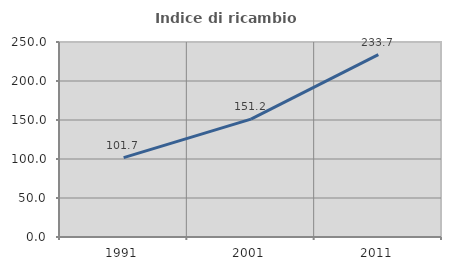
| Category | Indice di ricambio occupazionale  |
|---|---|
| 1991.0 | 101.745 |
| 2001.0 | 151.197 |
| 2011.0 | 233.736 |